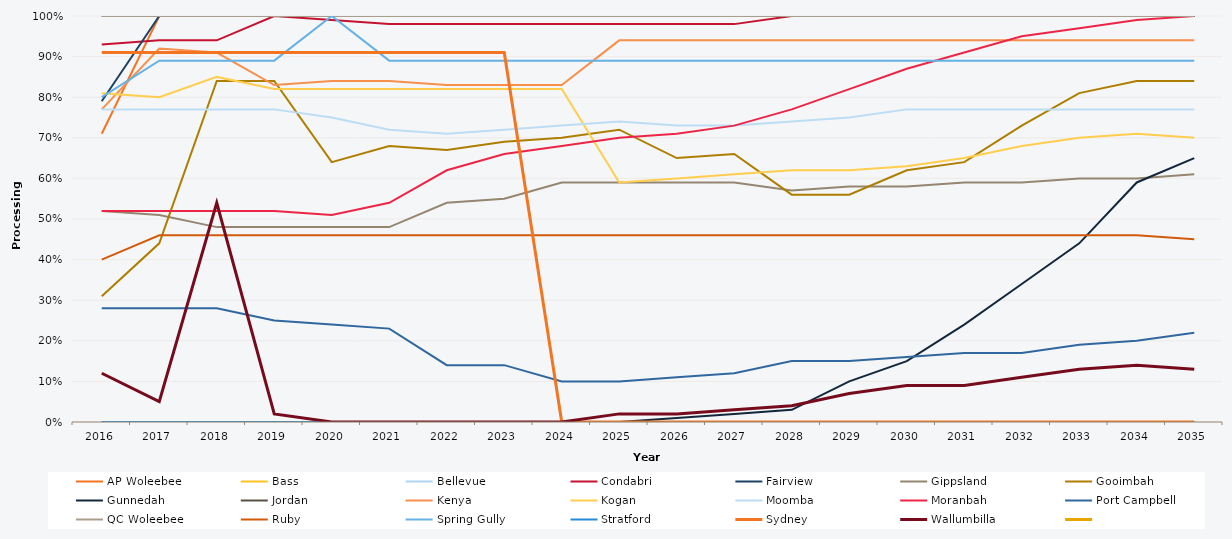
| Category | AP Woleebee | Bass | Bellevue | Condabri | Fairview | Gippsland | Gooimbah | Gunnedah | Jordan | Kenya | Kogan | Moomba | Moranbah | Port Campbell | QC Woleebee | Ruby | Spring Gully | Stratford | Sydney | Wallumbilla | Series 19 |
|---|---|---|---|---|---|---|---|---|---|---|---|---|---|---|---|---|---|---|---|---|---|
| 2016.0 | 0.71 | 1 | 1 | 0.93 | 0.79 | 0.52 | 0.31 | 0 | 1 | 0.77 | 0.81 | 0.77 | 0.52 | 0.28 | 1 | 0.4 | 0.8 | 0 | 0.91 | 0.12 |  |
| 2017.0 | 1 | 1 | 1 | 0.94 | 1 | 0.51 | 0.44 | 0 | 1 | 0.92 | 0.8 | 0.77 | 0.52 | 0.28 | 1 | 0.46 | 0.89 | 0 | 0.91 | 0.05 |  |
| 2018.0 | 1 | 1 | 1 | 0.94 | 1 | 0.48 | 0.84 | 0 | 1 | 0.91 | 0.85 | 0.77 | 0.52 | 0.28 | 1 | 0.46 | 0.89 | 0 | 0.91 | 0.54 |  |
| 2019.0 | 1 | 1 | 1 | 1 | 1 | 0.48 | 0.84 | 0 | 1 | 0.83 | 0.82 | 0.77 | 0.52 | 0.25 | 1 | 0.46 | 0.89 | 0 | 0.91 | 0.02 |  |
| 2020.0 | 1 | 1 | 1 | 0.99 | 1 | 0.48 | 0.64 | 0 | 1 | 0.84 | 0.82 | 0.75 | 0.51 | 0.24 | 1 | 0.46 | 1 | 0 | 0.91 | 0 |  |
| 2021.0 | 1 | 1 | 1 | 0.98 | 1 | 0.48 | 0.68 | 0 | 1 | 0.84 | 0.82 | 0.72 | 0.54 | 0.23 | 1 | 0.46 | 0.89 | 0 | 0.91 | 0 |  |
| 2022.0 | 1 | 1 | 1 | 0.98 | 1 | 0.54 | 0.67 | 0 | 1 | 0.83 | 0.82 | 0.71 | 0.62 | 0.14 | 1 | 0.46 | 0.89 | 0 | 0.91 | 0 |  |
| 2023.0 | 1 | 1 | 1 | 0.98 | 1 | 0.55 | 0.69 | 0 | 1 | 0.83 | 0.82 | 0.72 | 0.66 | 0.14 | 1 | 0.46 | 0.89 | 0 | 0.91 | 0 |  |
| 2024.0 | 1 | 1 | 1 | 0.98 | 1 | 0.59 | 0.7 | 0 | 1 | 0.83 | 0.82 | 0.73 | 0.68 | 0.1 | 1 | 0.46 | 0.89 | 0 | 0 | 0 |  |
| 2025.0 | 1 | 1 | 1 | 0.98 | 1 | 0.59 | 0.72 | 0 | 1 | 0.94 | 0.59 | 0.74 | 0.7 | 0.1 | 1 | 0.46 | 0.89 | 0 | 0 | 0.02 |  |
| 2026.0 | 1 | 1 | 1 | 0.98 | 1 | 0.59 | 0.65 | 0.01 | 1 | 0.94 | 0.6 | 0.73 | 0.71 | 0.11 | 1 | 0.46 | 0.89 | 0 | 0 | 0.02 |  |
| 2027.0 | 1 | 1 | 1 | 0.98 | 1 | 0.59 | 0.66 | 0.02 | 1 | 0.94 | 0.61 | 0.73 | 0.73 | 0.12 | 1 | 0.46 | 0.89 | 0 | 0 | 0.03 |  |
| 2028.0 | 1 | 1 | 1 | 1 | 1 | 0.57 | 0.56 | 0.03 | 1 | 0.94 | 0.62 | 0.74 | 0.77 | 0.15 | 1 | 0.46 | 0.89 | 0 | 0 | 0.04 |  |
| 2029.0 | 1 | 1 | 1 | 1 | 1 | 0.58 | 0.56 | 0.1 | 1 | 0.94 | 0.62 | 0.75 | 0.82 | 0.15 | 1 | 0.46 | 0.89 | 0 | 0 | 0.07 |  |
| 2030.0 | 1 | 1 | 1 | 1 | 1 | 0.58 | 0.62 | 0.15 | 1 | 0.94 | 0.63 | 0.77 | 0.87 | 0.16 | 1 | 0.46 | 0.89 | 0 | 0 | 0.09 |  |
| 2031.0 | 1 | 1 | 1 | 1 | 1 | 0.59 | 0.64 | 0.24 | 1 | 0.94 | 0.65 | 0.77 | 0.91 | 0.17 | 1 | 0.46 | 0.89 | 0 | 0 | 0.09 |  |
| 2032.0 | 1 | 1 | 1 | 1 | 1 | 0.59 | 0.73 | 0.34 | 1 | 0.94 | 0.68 | 0.77 | 0.95 | 0.17 | 1 | 0.46 | 0.89 | 0 | 0 | 0.11 |  |
| 2033.0 | 1 | 1 | 1 | 1 | 1 | 0.6 | 0.81 | 0.44 | 1 | 0.94 | 0.7 | 0.77 | 0.97 | 0.19 | 1 | 0.46 | 0.89 | 0 | 0 | 0.13 |  |
| 2034.0 | 1 | 1 | 1 | 1 | 1 | 0.6 | 0.84 | 0.59 | 1 | 0.94 | 0.71 | 0.77 | 0.99 | 0.2 | 1 | 0.46 | 0.89 | 0 | 0 | 0.14 |  |
| 2035.0 | 1 | 1 | 1 | 1 | 1 | 0.61 | 0.84 | 0.65 | 1 | 0.94 | 0.7 | 0.77 | 1 | 0.22 | 1 | 0.45 | 0.89 | 0 | 0 | 0.13 |  |